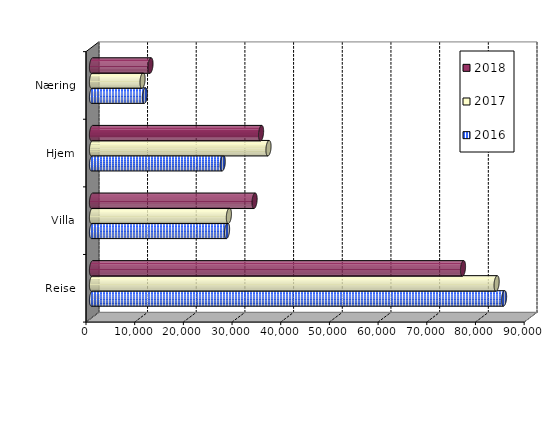
| Category | 2016 | 2017 | 2018 |
|---|---|---|---|
| Reise | 84640 | 83111 | 76206 |
| Villa | 27740.369 | 28116.801 | 33394.177 |
| Hjem | 26862 | 36252.135 | 34728.324 |
| Næring | 10872.839 | 10382.716 | 12011.183 |